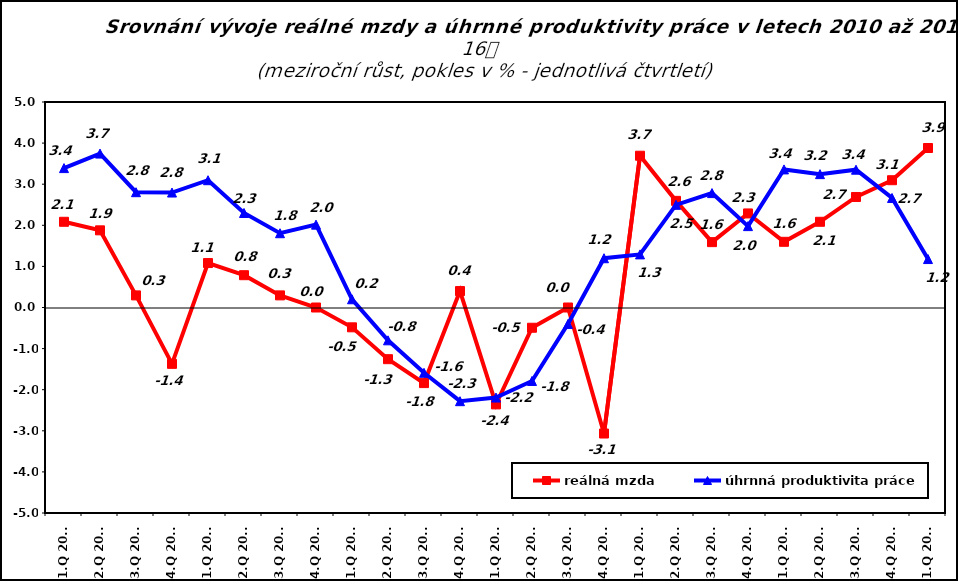
| Category | reálná mzda | úhrnná produktivita práce |
|---|---|---|
| 1.Q 2010 | 2.085 | 3.392 |
| 2.Q 2010 | 1.877 | 3.745 |
| 3.Q 2010 | 0.294 | 2.806 |
| 4.Q 2010 | -1.371 | 2.797 |
| 1.Q 2011 | 1.082 | 3.097 |
| 2.Q 2011 | 0.786 | 2.3 |
| 3.Q 2011 | 0.295 | 1.807 |
| 4.Q 2011 | 0 | 2.016 |
| 1.Q 2012 | -0.482 | 0.2 |
| 2.Q 2012 | -1.257 | -0.798 |
| 3.Q 2012 | -1.839 | -1.589 |
| 4.Q 2012 | 0.4 | -2.279 |
| 1.Q 2013 | -2.358 | -2.191 |
| 2.Q 2013 | -0.493 | -1.787 |
| 3.Q 2013 | 0 | -0.4 |
| 4.Q 2013 | -3.066 | 1.199 |
| 1.Q 2014 | 3.693 | 1.292 |
| 2.Q 2014 | 2.595 | 2.498 |
| 3.Q 2014 | 1.59 | 2.783 |
| 4.Q 2014 | 2.289 | 1.98 |
| 1.Q 2015 | 1.598 | 3.36 |
| 2.Q 2015 | 2.085 | 3.245 |
| 3.Q 2015 | 2.689 | 3.353 |
| 4.Q 2015 | 3.097 | 2.665 |
| 1.Q 2016 | 3.881 | 1.179 |